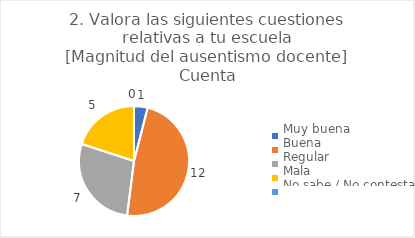
| Category | 2. Valora las siguientes cuestiones relativas a tu escuela
[Magnitud del ausentismo docente] |
|---|---|
| Muy buena  | 0.04 |
| Buena  | 0.48 |
| Regular  | 0.28 |
| Mala  | 0.2 |
| No sabe / No contesta | 0 |